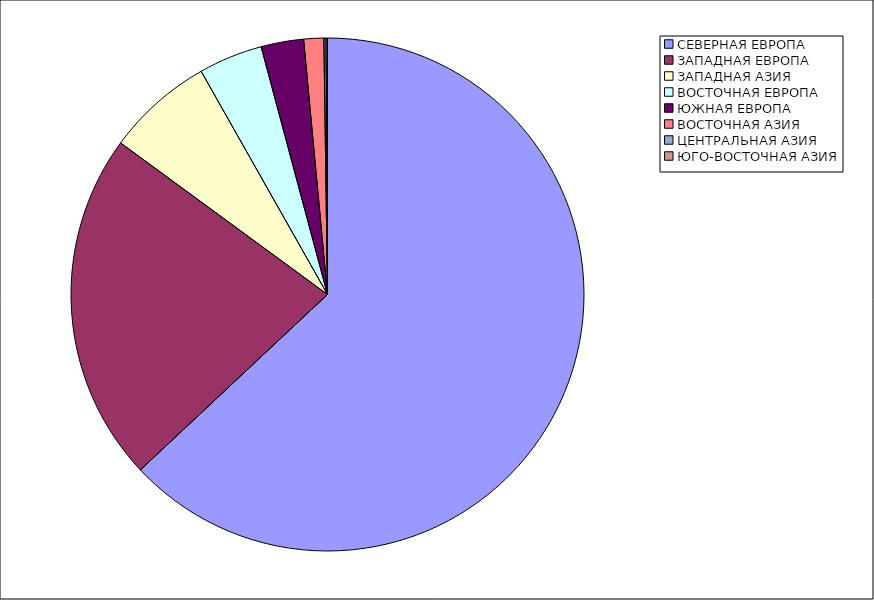
| Category | Оборот |
|---|---|
| СЕВЕРНАЯ ЕВРОПА | 63.013 |
| ЗАПАДНАЯ ЕВРОПА | 22.05 |
| ЗАПАДНАЯ АЗИЯ | 6.739 |
| ВОСТОЧНАЯ ЕВРОПА | 4.032 |
| ЮЖНАЯ ЕВРОПА | 2.68 |
| ВОСТОЧНАЯ АЗИЯ | 1.261 |
| ЦЕНТРАЛЬНАЯ АЗИЯ | 0.131 |
| ЮГО-ВОСТОЧНАЯ АЗИЯ | 0.094 |